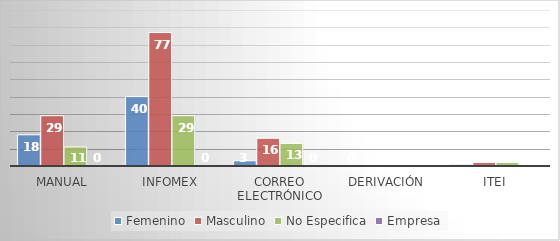
| Category | Femenino | Masculino | No Especifica | Empresa |
|---|---|---|---|---|
| Manual | 18 | 29 | 11 | 0 |
| Infomex | 40 | 77 | 29 | 0 |
| Correo Electrónico | 3 | 16 | 13 | 0 |
| Derivación | 0 | 0 | 0 | 0 |
| ITEI | 1 | 2 | 2 | 0 |